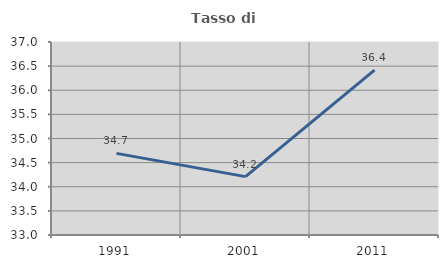
| Category | Tasso di occupazione   |
|---|---|
| 1991.0 | 34.692 |
| 2001.0 | 34.21 |
| 2011.0 | 36.418 |